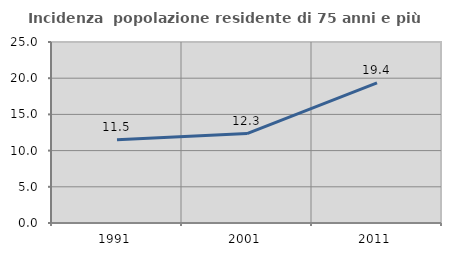
| Category | Incidenza  popolazione residente di 75 anni e più |
|---|---|
| 1991.0 | 11.513 |
| 2001.0 | 12.346 |
| 2011.0 | 19.355 |